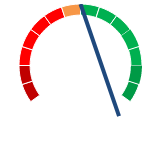
| Category | Escala |
|---|---|
| 0 | 1 |
| 1 | 1 |
| 2 | 1 |
| 3 | 1 |
| 4 | 1 |
| 5 | 1 |
| 6 | 1 |
| 7 | 1 |
| 8 | 1 |
| 9 | 1 |
| 10 | 1 |
| 11 | 1 |
| 12 | 1 |
| 13 | 1 |
| 14 | 6 |